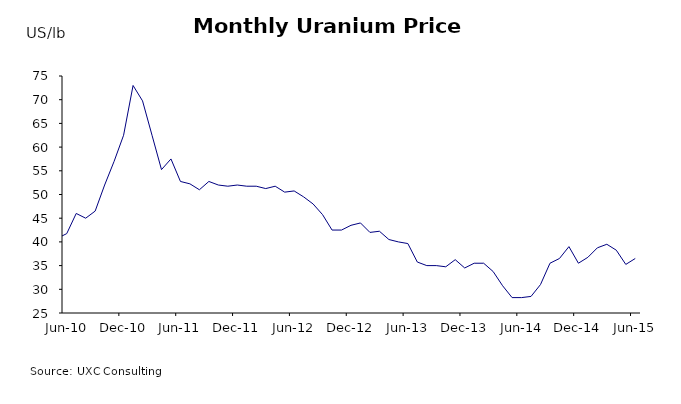
| Category | US$/lb |
|---|---|
| 2010-01-01 | 42.5 |
| 2010-02-01 | 41.75 |
| 2010-03-01 | 42 |
| 2010-04-01 | 41.75 |
| 2010-05-01 | 40.75 |
| 2010-06-01 | 41.75 |
| 2010-07-01 | 46 |
| 2010-08-01 | 45 |
| 2010-09-01 | 46.5 |
| 2010-10-01 | 52 |
| 2010-11-01 | 57 |
| 2010-12-01 | 62.5 |
| 2011-01-01 | 73 |
| 2011-02-01 | 69.75 |
| 2011-03-01 | 62.5 |
| 2011-04-01 | 55.25 |
| 2011-05-01 | 57.5 |
| 2011-06-01 | 52.75 |
| 2011-07-01 | 52.25 |
| 2011-08-01 | 51 |
| 2011-09-01 | 52.75 |
| 2011-10-01 | 52 |
| 2011-11-01 | 51.75 |
| 2011-12-01 | 52 |
| 2012-01-01 | 51.75 |
| 2012-02-01 | 51.75 |
| 2012-03-01 | 51.25 |
| 2012-04-01 | 51.75 |
| 2012-05-01 | 50.5 |
| 2012-06-01 | 50.75 |
| 2012-07-01 | 49.5 |
| 2012-08-01 | 48 |
| 2012-09-01 | 45.75 |
| 2012-10-01 | 42.5 |
| 2012-11-01 | 42.5 |
| 2012-12-01 | 43.5 |
| 2013-01-01 | 44 |
| 2013-02-01 | 42 |
| 2013-03-01 | 42.25 |
| 2013-04-01 | 40.5 |
| 2013-05-01 | 40 |
| 2013-06-01 | 39.65 |
| 2013-07-01 | 35.75 |
| 2013-08-01 | 35 |
| 2013-09-01 | 35 |
| 2013-10-01 | 34.75 |
| 2013-11-01 | 36.25 |
| 2013-12-01 | 34.5 |
| 2014-01-01 | 35.5 |
| 2014-02-01 | 35.5 |
| 2014-03-01 | 33.75 |
| 2014-04-01 | 30.75 |
| 2014-05-01 | 28.25 |
| 2014-06-01 | 28.25 |
| 2014-07-01 | 28.5 |
| 2014-08-01 | 31 |
| 2014-09-01 | 35.5 |
| 2014-10-01 | 36.5 |
| 2014-11-01 | 39 |
| 2014-12-01 | 35.5 |
| 2015-01-01 | 36.75 |
| 2015-02-01 | 38.75 |
| 2015-03-01 | 39.5 |
| 2015-04-01 | 38.25 |
| 2015-05-01 | 35.25 |
| 2015-06-01 | 36.5 |